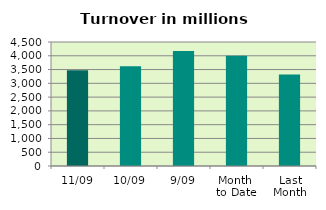
| Category | Series 0 |
|---|---|
| 11/09 | 3472.872 |
| 10/09 | 3618.142 |
| 9/09 | 4175.876 |
| Month 
to Date | 3996.585 |
| Last
Month | 3319.434 |